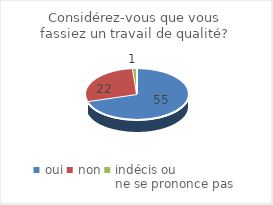
| Category | Considérez-vous que vous fassiez un travail de qualité? |
|---|---|
| oui | 55 |
| non | 22 |
| indécis ou 
ne se prononce pas | 1 |